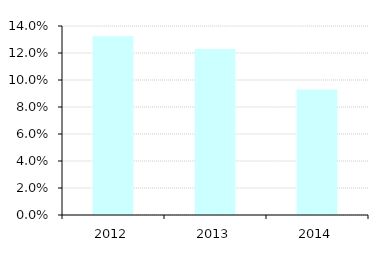
| Category | Operating Profit Ratio |
|---|---|
| 2012.0 | 0.132 |
| 2013.0 | 0.123 |
| 2014.0 | 0.093 |